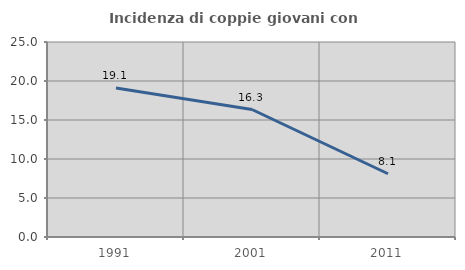
| Category | Incidenza di coppie giovani con figli |
|---|---|
| 1991.0 | 19.091 |
| 2001.0 | 16.346 |
| 2011.0 | 8.108 |